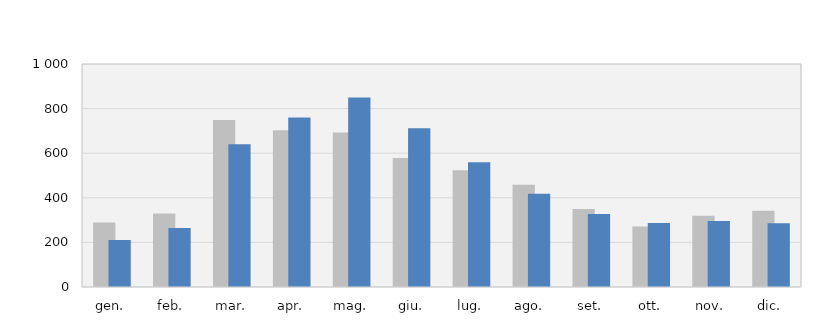
| Category | 2017 | 2018 |
|---|---|---|
| gen. | 289 | 211 |
| feb. | 330 | 265 |
| mar. | 749 | 640 |
| apr. | 703 | 760 |
| mag. | 693 | 850 |
| giu. | 579 | 712 |
| lug. | 523 | 559 |
| ago. | 458 | 418 |
| set. | 350 | 327 |
| ott. | 271 | 287 |
| nov. | 320 | 296 |
| dic. | 342 | 286 |